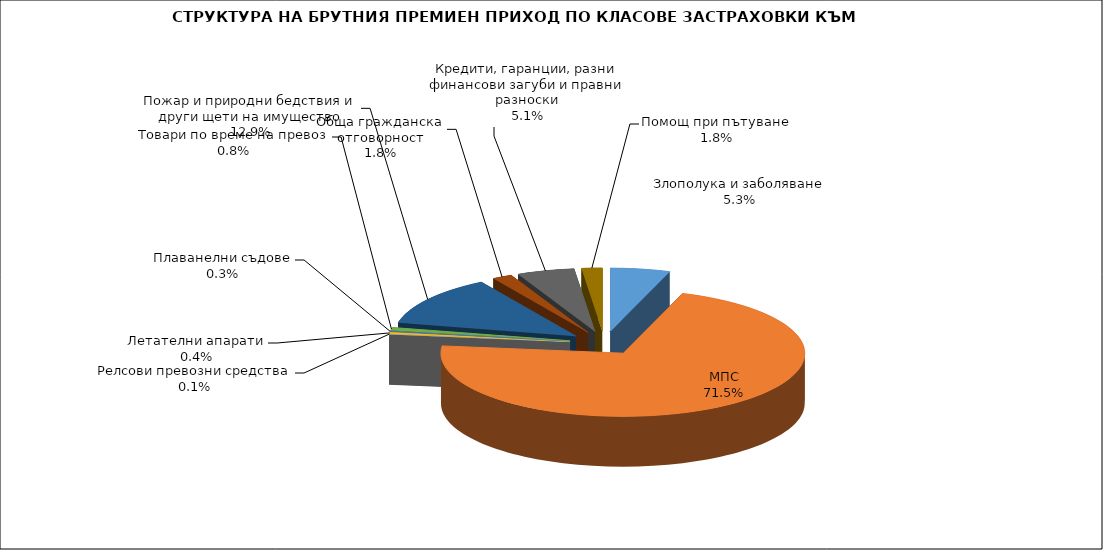
| Category | Злополука и заболяване |
|---|---|
| Злополука и заболяване | 0.053 |
| МПС | 0.715 |
| Релсови превозни средства | 0.001 |
| Летателни апарати | 0.004 |
| Плаванелни съдове | 0.003 |
| Товари по време на превоз | 0.008 |
| Пожар и природни бедствия и други щети на имущество | 0.129 |
| Обща гражданска отговорност | 0.018 |
| Кредити, гаранции, разни финансови загуби и правни разноски | 0.051 |
| Помощ при пътуване | 0.018 |